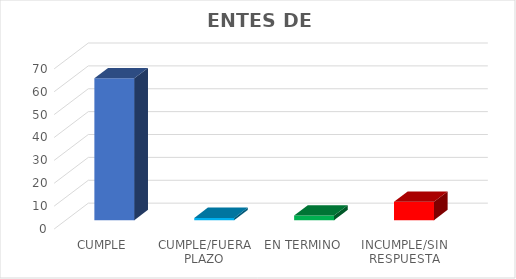
| Category | TOTAL |
|---|---|
| CUMPLE | 62 |
| CUMPLE/FUERA PLAZO | 1 |
| EN TERMINO | 2 |
| INCUMPLE/SIN RESPUESTA | 8 |